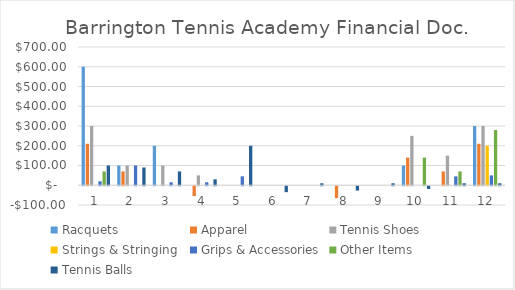
| Category | Racquets | Apparel | Tennis Shoes | Strings & Stringing | Grips & Accessories | Other Items | Tennis Balls |
|---|---|---|---|---|---|---|---|
| 0 | 600 | 210 | 300 | 0 | 20 | 70 | 100 |
| 1 | 100 | 70 | 100 | 0 | 100 | 0 | 90 |
| 2 | 200 | 0 | 100 | 0 | 15 | 0 | 70 |
| 3 | 0 | -50 | 50 | 0 | 15 | 0 | 30 |
| 4 | 0 | 0 | 0 | 0 | 45 | 0 | 200 |
| 5 | 0 | 0 | 0 | 0 | 0 | 0 | -30 |
| 6 | 0 | 0 | 0 | 0 | 0 | 0 | 10 |
| 7 | 0 | -60 | 0 | 0 | 0 | 0 | -22 |
| 8 | 0 | 0 | 0 | 0 | 0 | 0 | 10 |
| 9 | 100 | 140 | 250 | 0 | 0 | 140 | -14 |
| 10 | 0 | 70 | 150 | 0 | 45 | 70 | 10 |
| 11 | 300 | 210 | 300 | 200 | 50 | 280 | 10 |